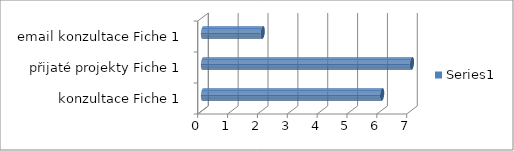
| Category | Series 0 |
|---|---|
|  konzultace Fiche 1 | 6 |
| přijaté projekty Fiche 1 | 7 |
| email konzultace Fiche 1 | 2 |